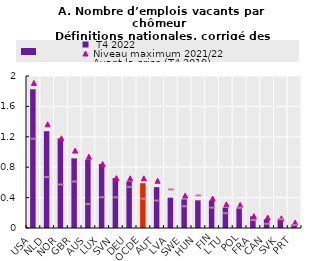
| Category |  T4 2022 |
|---|---|
| USA | 1.826 |
| NLD | 1.274 |
| NOR | 1.18 |
| GBR | 0.917 |
| AUS | 0.899 |
| LUX | 0.842 |
| SVN | 0.657 |
| DEU | 0.613 |
| OCDE | 0.59 |
| AUT | 0.537 |
| LVA | 0.4 |
| SWE | 0.378 |
| HUN | 0.364 |
| FIN | 0.36 |
| LTU | 0.268 |
| POL | 0.259 |
| FRA | 0.153 |
| CAN | 0.115 |
| SVK | 0.114 |
| PRT | 0.049 |